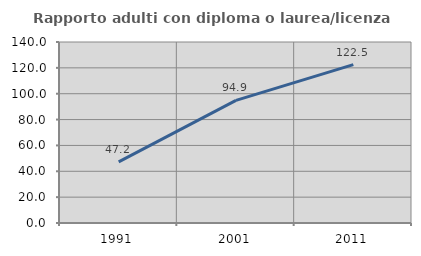
| Category | Rapporto adulti con diploma o laurea/licenza media  |
|---|---|
| 1991.0 | 47.222 |
| 2001.0 | 94.853 |
| 2011.0 | 122.464 |